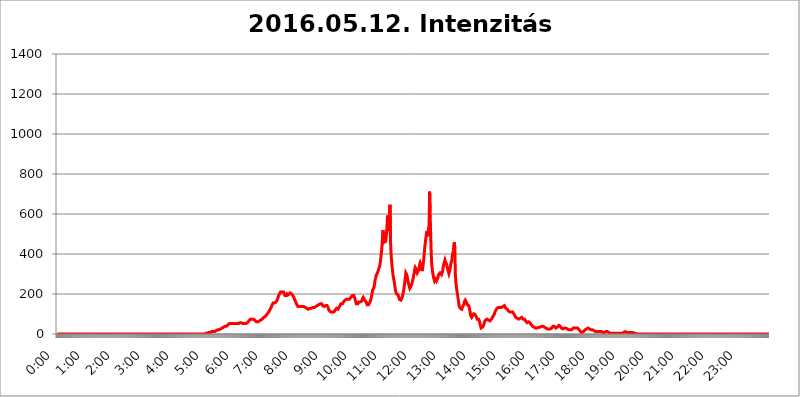
| Category | 2016.05.12. Intenzitás [W/m^2] |
|---|---|
| 0.0 | 0 |
| 0.0006944444444444445 | 0 |
| 0.001388888888888889 | 0 |
| 0.0020833333333333333 | 0 |
| 0.002777777777777778 | 0 |
| 0.003472222222222222 | 0 |
| 0.004166666666666667 | 0 |
| 0.004861111111111111 | 0 |
| 0.005555555555555556 | 0 |
| 0.0062499999999999995 | 0 |
| 0.006944444444444444 | 0 |
| 0.007638888888888889 | 0 |
| 0.008333333333333333 | 0 |
| 0.009027777777777779 | 0 |
| 0.009722222222222222 | 0 |
| 0.010416666666666666 | 0 |
| 0.011111111111111112 | 0 |
| 0.011805555555555555 | 0 |
| 0.012499999999999999 | 0 |
| 0.013194444444444444 | 0 |
| 0.013888888888888888 | 0 |
| 0.014583333333333332 | 0 |
| 0.015277777777777777 | 0 |
| 0.015972222222222224 | 0 |
| 0.016666666666666666 | 0 |
| 0.017361111111111112 | 0 |
| 0.018055555555555557 | 0 |
| 0.01875 | 0 |
| 0.019444444444444445 | 0 |
| 0.02013888888888889 | 0 |
| 0.020833333333333332 | 0 |
| 0.02152777777777778 | 0 |
| 0.022222222222222223 | 0 |
| 0.02291666666666667 | 0 |
| 0.02361111111111111 | 0 |
| 0.024305555555555556 | 0 |
| 0.024999999999999998 | 0 |
| 0.025694444444444447 | 0 |
| 0.02638888888888889 | 0 |
| 0.027083333333333334 | 0 |
| 0.027777777777777776 | 0 |
| 0.02847222222222222 | 0 |
| 0.029166666666666664 | 0 |
| 0.029861111111111113 | 0 |
| 0.030555555555555555 | 0 |
| 0.03125 | 0 |
| 0.03194444444444445 | 0 |
| 0.03263888888888889 | 0 |
| 0.03333333333333333 | 0 |
| 0.034027777777777775 | 0 |
| 0.034722222222222224 | 0 |
| 0.035416666666666666 | 0 |
| 0.036111111111111115 | 0 |
| 0.03680555555555556 | 0 |
| 0.0375 | 0 |
| 0.03819444444444444 | 0 |
| 0.03888888888888889 | 0 |
| 0.03958333333333333 | 0 |
| 0.04027777777777778 | 0 |
| 0.04097222222222222 | 0 |
| 0.041666666666666664 | 0 |
| 0.042361111111111106 | 0 |
| 0.04305555555555556 | 0 |
| 0.043750000000000004 | 0 |
| 0.044444444444444446 | 0 |
| 0.04513888888888889 | 0 |
| 0.04583333333333334 | 0 |
| 0.04652777777777778 | 0 |
| 0.04722222222222222 | 0 |
| 0.04791666666666666 | 0 |
| 0.04861111111111111 | 0 |
| 0.049305555555555554 | 0 |
| 0.049999999999999996 | 0 |
| 0.05069444444444445 | 0 |
| 0.051388888888888894 | 0 |
| 0.052083333333333336 | 0 |
| 0.05277777777777778 | 0 |
| 0.05347222222222222 | 0 |
| 0.05416666666666667 | 0 |
| 0.05486111111111111 | 0 |
| 0.05555555555555555 | 0 |
| 0.05625 | 0 |
| 0.05694444444444444 | 0 |
| 0.057638888888888885 | 0 |
| 0.05833333333333333 | 0 |
| 0.05902777777777778 | 0 |
| 0.059722222222222225 | 0 |
| 0.06041666666666667 | 0 |
| 0.061111111111111116 | 0 |
| 0.06180555555555556 | 0 |
| 0.0625 | 0 |
| 0.06319444444444444 | 0 |
| 0.06388888888888888 | 0 |
| 0.06458333333333334 | 0 |
| 0.06527777777777778 | 0 |
| 0.06597222222222222 | 0 |
| 0.06666666666666667 | 0 |
| 0.06736111111111111 | 0 |
| 0.06805555555555555 | 0 |
| 0.06874999999999999 | 0 |
| 0.06944444444444443 | 0 |
| 0.07013888888888889 | 0 |
| 0.07083333333333333 | 0 |
| 0.07152777777777779 | 0 |
| 0.07222222222222223 | 0 |
| 0.07291666666666667 | 0 |
| 0.07361111111111111 | 0 |
| 0.07430555555555556 | 0 |
| 0.075 | 0 |
| 0.07569444444444444 | 0 |
| 0.0763888888888889 | 0 |
| 0.07708333333333334 | 0 |
| 0.07777777777777778 | 0 |
| 0.07847222222222222 | 0 |
| 0.07916666666666666 | 0 |
| 0.0798611111111111 | 0 |
| 0.08055555555555556 | 0 |
| 0.08125 | 0 |
| 0.08194444444444444 | 0 |
| 0.08263888888888889 | 0 |
| 0.08333333333333333 | 0 |
| 0.08402777777777777 | 0 |
| 0.08472222222222221 | 0 |
| 0.08541666666666665 | 0 |
| 0.08611111111111112 | 0 |
| 0.08680555555555557 | 0 |
| 0.08750000000000001 | 0 |
| 0.08819444444444445 | 0 |
| 0.08888888888888889 | 0 |
| 0.08958333333333333 | 0 |
| 0.09027777777777778 | 0 |
| 0.09097222222222222 | 0 |
| 0.09166666666666667 | 0 |
| 0.09236111111111112 | 0 |
| 0.09305555555555556 | 0 |
| 0.09375 | 0 |
| 0.09444444444444444 | 0 |
| 0.09513888888888888 | 0 |
| 0.09583333333333333 | 0 |
| 0.09652777777777777 | 0 |
| 0.09722222222222222 | 0 |
| 0.09791666666666667 | 0 |
| 0.09861111111111111 | 0 |
| 0.09930555555555555 | 0 |
| 0.09999999999999999 | 0 |
| 0.10069444444444443 | 0 |
| 0.1013888888888889 | 0 |
| 0.10208333333333335 | 0 |
| 0.10277777777777779 | 0 |
| 0.10347222222222223 | 0 |
| 0.10416666666666667 | 0 |
| 0.10486111111111111 | 0 |
| 0.10555555555555556 | 0 |
| 0.10625 | 0 |
| 0.10694444444444444 | 0 |
| 0.1076388888888889 | 0 |
| 0.10833333333333334 | 0 |
| 0.10902777777777778 | 0 |
| 0.10972222222222222 | 0 |
| 0.1111111111111111 | 0 |
| 0.11180555555555556 | 0 |
| 0.11180555555555556 | 0 |
| 0.1125 | 0 |
| 0.11319444444444444 | 0 |
| 0.11388888888888889 | 0 |
| 0.11458333333333333 | 0 |
| 0.11527777777777777 | 0 |
| 0.11597222222222221 | 0 |
| 0.11666666666666665 | 0 |
| 0.1173611111111111 | 0 |
| 0.11805555555555557 | 0 |
| 0.11944444444444445 | 0 |
| 0.12013888888888889 | 0 |
| 0.12083333333333333 | 0 |
| 0.12152777777777778 | 0 |
| 0.12222222222222223 | 0 |
| 0.12291666666666667 | 0 |
| 0.12291666666666667 | 0 |
| 0.12361111111111112 | 0 |
| 0.12430555555555556 | 0 |
| 0.125 | 0 |
| 0.12569444444444444 | 0 |
| 0.12638888888888888 | 0 |
| 0.12708333333333333 | 0 |
| 0.16875 | 0 |
| 0.12847222222222224 | 0 |
| 0.12916666666666668 | 0 |
| 0.12986111111111112 | 0 |
| 0.13055555555555556 | 0 |
| 0.13125 | 0 |
| 0.13194444444444445 | 0 |
| 0.1326388888888889 | 0 |
| 0.13333333333333333 | 0 |
| 0.13402777777777777 | 0 |
| 0.13402777777777777 | 0 |
| 0.13472222222222222 | 0 |
| 0.13541666666666666 | 0 |
| 0.1361111111111111 | 0 |
| 0.13749999999999998 | 0 |
| 0.13819444444444443 | 0 |
| 0.1388888888888889 | 0 |
| 0.13958333333333334 | 0 |
| 0.14027777777777778 | 0 |
| 0.14097222222222222 | 0 |
| 0.14166666666666666 | 0 |
| 0.1423611111111111 | 0 |
| 0.14305555555555557 | 0 |
| 0.14375000000000002 | 0 |
| 0.14444444444444446 | 0 |
| 0.1451388888888889 | 0 |
| 0.1451388888888889 | 0 |
| 0.14652777777777778 | 0 |
| 0.14722222222222223 | 0 |
| 0.14791666666666667 | 0 |
| 0.1486111111111111 | 0 |
| 0.14930555555555555 | 0 |
| 0.15 | 0 |
| 0.15069444444444444 | 0 |
| 0.15138888888888888 | 0 |
| 0.15208333333333332 | 0 |
| 0.15277777777777776 | 0 |
| 0.15347222222222223 | 0 |
| 0.15416666666666667 | 0 |
| 0.15486111111111112 | 0 |
| 0.15555555555555556 | 0 |
| 0.15625 | 0 |
| 0.15694444444444444 | 0 |
| 0.15763888888888888 | 0 |
| 0.15833333333333333 | 0 |
| 0.15902777777777777 | 0 |
| 0.15972222222222224 | 0 |
| 0.16041666666666668 | 0 |
| 0.16111111111111112 | 0 |
| 0.16180555555555556 | 0 |
| 0.1625 | 0 |
| 0.16319444444444445 | 0 |
| 0.1638888888888889 | 0 |
| 0.16458333333333333 | 0 |
| 0.16527777777777777 | 0 |
| 0.16597222222222222 | 0 |
| 0.16666666666666666 | 0 |
| 0.1673611111111111 | 0 |
| 0.16805555555555554 | 0 |
| 0.16874999999999998 | 0 |
| 0.16944444444444443 | 0 |
| 0.17013888888888887 | 0 |
| 0.1708333333333333 | 0 |
| 0.17152777777777775 | 0 |
| 0.17222222222222225 | 0 |
| 0.1729166666666667 | 0 |
| 0.17361111111111113 | 0 |
| 0.17430555555555557 | 0 |
| 0.17500000000000002 | 0 |
| 0.17569444444444446 | 0 |
| 0.1763888888888889 | 0 |
| 0.17708333333333334 | 0 |
| 0.17777777777777778 | 0 |
| 0.17847222222222223 | 0 |
| 0.17916666666666667 | 0 |
| 0.1798611111111111 | 0 |
| 0.18055555555555555 | 0 |
| 0.18125 | 0 |
| 0.18194444444444444 | 0 |
| 0.1826388888888889 | 0 |
| 0.18333333333333335 | 0 |
| 0.1840277777777778 | 0 |
| 0.18472222222222223 | 0 |
| 0.18541666666666667 | 0 |
| 0.18611111111111112 | 0 |
| 0.18680555555555556 | 0 |
| 0.1875 | 0 |
| 0.18819444444444444 | 0 |
| 0.18888888888888888 | 0 |
| 0.18958333333333333 | 0 |
| 0.19027777777777777 | 0 |
| 0.1909722222222222 | 0 |
| 0.19166666666666665 | 0 |
| 0.19236111111111112 | 0 |
| 0.19305555555555554 | 0 |
| 0.19375 | 0 |
| 0.19444444444444445 | 0 |
| 0.1951388888888889 | 0 |
| 0.19583333333333333 | 0 |
| 0.19652777777777777 | 0 |
| 0.19722222222222222 | 0 |
| 0.19791666666666666 | 0 |
| 0.1986111111111111 | 0 |
| 0.19930555555555554 | 0 |
| 0.19999999999999998 | 0 |
| 0.20069444444444443 | 0 |
| 0.20138888888888887 | 0 |
| 0.2020833333333333 | 0 |
| 0.2027777777777778 | 0 |
| 0.2034722222222222 | 0 |
| 0.2041666666666667 | 0 |
| 0.20486111111111113 | 0 |
| 0.20555555555555557 | 0 |
| 0.20625000000000002 | 0 |
| 0.20694444444444446 | 0 |
| 0.2076388888888889 | 3.525 |
| 0.20833333333333334 | 3.525 |
| 0.20902777777777778 | 3.525 |
| 0.20972222222222223 | 3.525 |
| 0.21041666666666667 | 3.525 |
| 0.2111111111111111 | 3.525 |
| 0.21180555555555555 | 7.887 |
| 0.2125 | 7.887 |
| 0.21319444444444444 | 7.887 |
| 0.2138888888888889 | 7.887 |
| 0.21458333333333335 | 7.887 |
| 0.2152777777777778 | 7.887 |
| 0.21597222222222223 | 12.257 |
| 0.21666666666666667 | 12.257 |
| 0.21736111111111112 | 12.257 |
| 0.21805555555555556 | 12.257 |
| 0.21875 | 12.257 |
| 0.21944444444444444 | 12.257 |
| 0.22013888888888888 | 12.257 |
| 0.22083333333333333 | 12.257 |
| 0.22152777777777777 | 16.636 |
| 0.2222222222222222 | 16.636 |
| 0.22291666666666665 | 16.636 |
| 0.2236111111111111 | 16.636 |
| 0.22430555555555556 | 16.636 |
| 0.225 | 21.024 |
| 0.22569444444444445 | 21.024 |
| 0.2263888888888889 | 21.024 |
| 0.22708333333333333 | 21.024 |
| 0.22777777777777777 | 25.419 |
| 0.22847222222222222 | 25.419 |
| 0.22916666666666666 | 25.419 |
| 0.2298611111111111 | 25.419 |
| 0.23055555555555554 | 25.419 |
| 0.23124999999999998 | 29.823 |
| 0.23194444444444443 | 29.823 |
| 0.23263888888888887 | 29.823 |
| 0.2333333333333333 | 34.234 |
| 0.2340277777777778 | 34.234 |
| 0.2347222222222222 | 38.653 |
| 0.2354166666666667 | 38.653 |
| 0.23611111111111113 | 38.653 |
| 0.23680555555555557 | 38.653 |
| 0.23750000000000002 | 38.653 |
| 0.23819444444444446 | 43.079 |
| 0.2388888888888889 | 43.079 |
| 0.23958333333333334 | 47.511 |
| 0.24027777777777778 | 51.951 |
| 0.24097222222222223 | 51.951 |
| 0.24166666666666667 | 51.951 |
| 0.2423611111111111 | 51.951 |
| 0.24305555555555555 | 51.951 |
| 0.24375 | 51.951 |
| 0.24444444444444446 | 51.951 |
| 0.24513888888888888 | 51.951 |
| 0.24583333333333335 | 51.951 |
| 0.2465277777777778 | 51.951 |
| 0.24722222222222223 | 51.951 |
| 0.24791666666666667 | 51.951 |
| 0.24861111111111112 | 51.951 |
| 0.24930555555555556 | 51.951 |
| 0.25 | 51.951 |
| 0.25069444444444444 | 51.951 |
| 0.2513888888888889 | 51.951 |
| 0.2520833333333333 | 51.951 |
| 0.25277777777777777 | 51.951 |
| 0.2534722222222222 | 51.951 |
| 0.25416666666666665 | 51.951 |
| 0.2548611111111111 | 56.398 |
| 0.2555555555555556 | 56.398 |
| 0.25625000000000003 | 56.398 |
| 0.2569444444444445 | 56.398 |
| 0.2576388888888889 | 56.398 |
| 0.25833333333333336 | 56.398 |
| 0.2590277777777778 | 56.398 |
| 0.25972222222222224 | 51.951 |
| 0.2604166666666667 | 51.951 |
| 0.2611111111111111 | 47.511 |
| 0.26180555555555557 | 47.511 |
| 0.2625 | 51.951 |
| 0.26319444444444445 | 51.951 |
| 0.2638888888888889 | 51.951 |
| 0.26458333333333334 | 51.951 |
| 0.2652777777777778 | 56.398 |
| 0.2659722222222222 | 56.398 |
| 0.26666666666666666 | 56.398 |
| 0.2673611111111111 | 60.85 |
| 0.26805555555555555 | 60.85 |
| 0.26875 | 65.31 |
| 0.26944444444444443 | 65.31 |
| 0.2701388888888889 | 69.775 |
| 0.2708333333333333 | 74.246 |
| 0.27152777777777776 | 74.246 |
| 0.2722222222222222 | 74.246 |
| 0.27291666666666664 | 74.246 |
| 0.2736111111111111 | 74.246 |
| 0.2743055555555555 | 74.246 |
| 0.27499999999999997 | 74.246 |
| 0.27569444444444446 | 74.246 |
| 0.27638888888888885 | 69.775 |
| 0.27708333333333335 | 69.775 |
| 0.2777777777777778 | 65.31 |
| 0.27847222222222223 | 65.31 |
| 0.2791666666666667 | 60.85 |
| 0.2798611111111111 | 60.85 |
| 0.28055555555555556 | 60.85 |
| 0.28125 | 60.85 |
| 0.28194444444444444 | 60.85 |
| 0.2826388888888889 | 60.85 |
| 0.2833333333333333 | 65.31 |
| 0.28402777777777777 | 65.31 |
| 0.2847222222222222 | 65.31 |
| 0.28541666666666665 | 69.775 |
| 0.28611111111111115 | 69.775 |
| 0.28680555555555554 | 74.246 |
| 0.28750000000000003 | 74.246 |
| 0.2881944444444445 | 78.722 |
| 0.2888888888888889 | 78.722 |
| 0.28958333333333336 | 83.205 |
| 0.2902777777777778 | 83.205 |
| 0.29097222222222224 | 83.205 |
| 0.2916666666666667 | 87.692 |
| 0.2923611111111111 | 92.184 |
| 0.29305555555555557 | 92.184 |
| 0.29375 | 96.682 |
| 0.29444444444444445 | 101.184 |
| 0.2951388888888889 | 101.184 |
| 0.29583333333333334 | 105.69 |
| 0.2965277777777778 | 110.201 |
| 0.2972222222222222 | 114.716 |
| 0.29791666666666666 | 119.235 |
| 0.2986111111111111 | 123.758 |
| 0.29930555555555555 | 128.284 |
| 0.3 | 132.814 |
| 0.30069444444444443 | 137.347 |
| 0.3013888888888889 | 146.423 |
| 0.3020833333333333 | 150.964 |
| 0.30277777777777776 | 155.509 |
| 0.3034722222222222 | 155.509 |
| 0.30416666666666664 | 155.509 |
| 0.3048611111111111 | 155.509 |
| 0.3055555555555555 | 155.509 |
| 0.30624999999999997 | 155.509 |
| 0.3069444444444444 | 160.056 |
| 0.3076388888888889 | 164.605 |
| 0.30833333333333335 | 169.156 |
| 0.3090277777777778 | 173.709 |
| 0.30972222222222223 | 182.82 |
| 0.3104166666666667 | 191.937 |
| 0.3111111111111111 | 196.497 |
| 0.31180555555555556 | 201.058 |
| 0.3125 | 205.62 |
| 0.31319444444444444 | 210.182 |
| 0.3138888888888889 | 210.182 |
| 0.3145833333333333 | 210.182 |
| 0.31527777777777777 | 210.182 |
| 0.3159722222222222 | 210.182 |
| 0.31666666666666665 | 210.182 |
| 0.31736111111111115 | 210.182 |
| 0.31805555555555554 | 201.058 |
| 0.31875000000000003 | 196.497 |
| 0.3194444444444445 | 191.937 |
| 0.3201388888888889 | 191.937 |
| 0.32083333333333336 | 191.937 |
| 0.3215277777777778 | 191.937 |
| 0.32222222222222224 | 201.058 |
| 0.3229166666666667 | 201.058 |
| 0.3236111111111111 | 196.497 |
| 0.32430555555555557 | 196.497 |
| 0.325 | 196.497 |
| 0.32569444444444445 | 201.058 |
| 0.3263888888888889 | 205.62 |
| 0.32708333333333334 | 205.62 |
| 0.3277777777777778 | 205.62 |
| 0.3284722222222222 | 201.058 |
| 0.32916666666666666 | 201.058 |
| 0.3298611111111111 | 196.497 |
| 0.33055555555555555 | 191.937 |
| 0.33125 | 187.378 |
| 0.33194444444444443 | 182.82 |
| 0.3326388888888889 | 173.709 |
| 0.3333333333333333 | 169.156 |
| 0.3340277777777778 | 164.605 |
| 0.3347222222222222 | 155.509 |
| 0.3354166666666667 | 150.964 |
| 0.3361111111111111 | 146.423 |
| 0.3368055555555556 | 141.884 |
| 0.33749999999999997 | 137.347 |
| 0.33819444444444446 | 137.347 |
| 0.33888888888888885 | 132.814 |
| 0.33958333333333335 | 137.347 |
| 0.34027777777777773 | 132.814 |
| 0.34097222222222223 | 137.347 |
| 0.3416666666666666 | 137.347 |
| 0.3423611111111111 | 137.347 |
| 0.3430555555555555 | 137.347 |
| 0.34375 | 137.347 |
| 0.3444444444444445 | 137.347 |
| 0.3451388888888889 | 137.347 |
| 0.3458333333333334 | 137.347 |
| 0.34652777777777777 | 137.347 |
| 0.34722222222222227 | 132.814 |
| 0.34791666666666665 | 132.814 |
| 0.34861111111111115 | 128.284 |
| 0.34930555555555554 | 128.284 |
| 0.35000000000000003 | 128.284 |
| 0.3506944444444444 | 123.758 |
| 0.3513888888888889 | 123.758 |
| 0.3520833333333333 | 123.758 |
| 0.3527777777777778 | 123.758 |
| 0.3534722222222222 | 123.758 |
| 0.3541666666666667 | 128.284 |
| 0.3548611111111111 | 128.284 |
| 0.35555555555555557 | 128.284 |
| 0.35625 | 128.284 |
| 0.35694444444444445 | 132.814 |
| 0.3576388888888889 | 132.814 |
| 0.35833333333333334 | 132.814 |
| 0.3590277777777778 | 132.814 |
| 0.3597222222222222 | 132.814 |
| 0.36041666666666666 | 132.814 |
| 0.3611111111111111 | 132.814 |
| 0.36180555555555555 | 132.814 |
| 0.3625 | 137.347 |
| 0.36319444444444443 | 137.347 |
| 0.3638888888888889 | 141.884 |
| 0.3645833333333333 | 141.884 |
| 0.3652777777777778 | 146.423 |
| 0.3659722222222222 | 146.423 |
| 0.3666666666666667 | 146.423 |
| 0.3673611111111111 | 146.423 |
| 0.3680555555555556 | 146.423 |
| 0.36874999999999997 | 150.964 |
| 0.36944444444444446 | 150.964 |
| 0.37013888888888885 | 150.964 |
| 0.37083333333333335 | 150.964 |
| 0.37152777777777773 | 146.423 |
| 0.37222222222222223 | 141.884 |
| 0.3729166666666666 | 141.884 |
| 0.3736111111111111 | 137.347 |
| 0.3743055555555555 | 137.347 |
| 0.375 | 137.347 |
| 0.3756944444444445 | 137.347 |
| 0.3763888888888889 | 141.884 |
| 0.3770833333333334 | 146.423 |
| 0.37777777777777777 | 146.423 |
| 0.37847222222222227 | 141.884 |
| 0.37916666666666665 | 141.884 |
| 0.37986111111111115 | 132.814 |
| 0.38055555555555554 | 123.758 |
| 0.38125000000000003 | 119.235 |
| 0.3819444444444444 | 114.716 |
| 0.3826388888888889 | 110.201 |
| 0.3833333333333333 | 110.201 |
| 0.3840277777777778 | 110.201 |
| 0.3847222222222222 | 105.69 |
| 0.3854166666666667 | 105.69 |
| 0.3861111111111111 | 110.201 |
| 0.38680555555555557 | 110.201 |
| 0.3875 | 110.201 |
| 0.38819444444444445 | 110.201 |
| 0.3888888888888889 | 114.716 |
| 0.38958333333333334 | 119.235 |
| 0.3902777777777778 | 119.235 |
| 0.3909722222222222 | 123.758 |
| 0.39166666666666666 | 128.284 |
| 0.3923611111111111 | 128.284 |
| 0.39305555555555555 | 123.758 |
| 0.39375 | 123.758 |
| 0.39444444444444443 | 128.284 |
| 0.3951388888888889 | 132.814 |
| 0.3958333333333333 | 137.347 |
| 0.3965277777777778 | 141.884 |
| 0.3972222222222222 | 146.423 |
| 0.3979166666666667 | 150.964 |
| 0.3986111111111111 | 150.964 |
| 0.3993055555555556 | 146.423 |
| 0.39999999999999997 | 150.964 |
| 0.40069444444444446 | 155.509 |
| 0.40138888888888885 | 160.056 |
| 0.40208333333333335 | 160.056 |
| 0.40277777777777773 | 164.605 |
| 0.40347222222222223 | 169.156 |
| 0.4041666666666666 | 173.709 |
| 0.4048611111111111 | 173.709 |
| 0.4055555555555555 | 173.709 |
| 0.40625 | 173.709 |
| 0.4069444444444445 | 173.709 |
| 0.4076388888888889 | 173.709 |
| 0.4083333333333334 | 173.709 |
| 0.40902777777777777 | 173.709 |
| 0.40972222222222227 | 173.709 |
| 0.41041666666666665 | 178.264 |
| 0.41111111111111115 | 178.264 |
| 0.41180555555555554 | 182.82 |
| 0.41250000000000003 | 182.82 |
| 0.4131944444444444 | 187.378 |
| 0.4138888888888889 | 191.937 |
| 0.4145833333333333 | 191.937 |
| 0.4152777777777778 | 191.937 |
| 0.4159722222222222 | 191.937 |
| 0.4166666666666667 | 187.378 |
| 0.4173611111111111 | 178.264 |
| 0.41805555555555557 | 169.156 |
| 0.41875 | 160.056 |
| 0.41944444444444445 | 150.964 |
| 0.4201388888888889 | 146.423 |
| 0.42083333333333334 | 146.423 |
| 0.4215277777777778 | 150.964 |
| 0.4222222222222222 | 155.509 |
| 0.42291666666666666 | 160.056 |
| 0.4236111111111111 | 160.056 |
| 0.42430555555555555 | 164.605 |
| 0.425 | 160.056 |
| 0.42569444444444443 | 160.056 |
| 0.4263888888888889 | 160.056 |
| 0.4270833333333333 | 164.605 |
| 0.4277777777777778 | 173.709 |
| 0.4284722222222222 | 178.264 |
| 0.4291666666666667 | 182.82 |
| 0.4298611111111111 | 187.378 |
| 0.4305555555555556 | 178.264 |
| 0.43124999999999997 | 169.156 |
| 0.43194444444444446 | 164.605 |
| 0.43263888888888885 | 164.605 |
| 0.43333333333333335 | 160.056 |
| 0.43402777777777773 | 155.509 |
| 0.43472222222222223 | 146.423 |
| 0.4354166666666666 | 146.423 |
| 0.4361111111111111 | 141.884 |
| 0.4368055555555555 | 146.423 |
| 0.4375 | 146.423 |
| 0.4381944444444445 | 155.509 |
| 0.4388888888888889 | 160.056 |
| 0.4395833333333334 | 169.156 |
| 0.44027777777777777 | 178.264 |
| 0.44097222222222227 | 191.937 |
| 0.44166666666666665 | 205.62 |
| 0.44236111111111115 | 219.309 |
| 0.44305555555555554 | 223.873 |
| 0.44375000000000003 | 228.436 |
| 0.4444444444444444 | 237.564 |
| 0.4451388888888889 | 251.251 |
| 0.4458333333333333 | 269.49 |
| 0.4465277777777778 | 278.603 |
| 0.4472222222222222 | 292.259 |
| 0.4479166666666667 | 296.808 |
| 0.4486111111111111 | 301.354 |
| 0.44930555555555557 | 305.898 |
| 0.45 | 314.98 |
| 0.45069444444444445 | 324.052 |
| 0.4513888888888889 | 328.584 |
| 0.45208333333333334 | 337.639 |
| 0.4527777777777778 | 351.198 |
| 0.4534722222222222 | 369.23 |
| 0.45416666666666666 | 391.685 |
| 0.4548611111111111 | 414.035 |
| 0.45555555555555555 | 445.129 |
| 0.45625 | 484.735 |
| 0.45694444444444443 | 519.555 |
| 0.4576388888888889 | 475.972 |
| 0.4583333333333333 | 458.38 |
| 0.4590277777777778 | 458.38 |
| 0.4597222222222222 | 458.38 |
| 0.4604166666666667 | 462.786 |
| 0.4611111111111111 | 475.972 |
| 0.4618055555555556 | 502.192 |
| 0.46249999999999997 | 536.82 |
| 0.46319444444444446 | 592.233 |
| 0.46388888888888885 | 562.53 |
| 0.46458333333333335 | 549.704 |
| 0.46527777777777773 | 515.223 |
| 0.46597222222222223 | 549.704 |
| 0.4666666666666666 | 646.537 |
| 0.4673611111111111 | 471.582 |
| 0.4680555555555555 | 409.574 |
| 0.46875 | 373.729 |
| 0.4694444444444445 | 342.162 |
| 0.4701388888888889 | 319.517 |
| 0.4708333333333334 | 296.808 |
| 0.47152777777777777 | 283.156 |
| 0.47222222222222227 | 269.49 |
| 0.47291666666666665 | 255.813 |
| 0.47361111111111115 | 237.564 |
| 0.47430555555555554 | 219.309 |
| 0.47500000000000003 | 210.182 |
| 0.4756944444444444 | 201.058 |
| 0.4763888888888889 | 201.058 |
| 0.4770833333333333 | 201.058 |
| 0.4777777777777778 | 196.497 |
| 0.4784722222222222 | 191.937 |
| 0.4791666666666667 | 182.82 |
| 0.4798611111111111 | 173.709 |
| 0.48055555555555557 | 169.156 |
| 0.48125 | 169.156 |
| 0.48194444444444445 | 169.156 |
| 0.4826388888888889 | 173.709 |
| 0.48333333333333334 | 178.264 |
| 0.4840277777777778 | 187.378 |
| 0.4847222222222222 | 196.497 |
| 0.48541666666666666 | 210.182 |
| 0.4861111111111111 | 223.873 |
| 0.48680555555555555 | 242.127 |
| 0.4875 | 260.373 |
| 0.48819444444444443 | 283.156 |
| 0.4888888888888889 | 305.898 |
| 0.4895833333333333 | 305.898 |
| 0.4902777777777778 | 296.808 |
| 0.4909722222222222 | 283.156 |
| 0.4916666666666667 | 269.49 |
| 0.4923611111111111 | 255.813 |
| 0.4930555555555556 | 246.689 |
| 0.49374999999999997 | 237.564 |
| 0.49444444444444446 | 228.436 |
| 0.49513888888888885 | 228.436 |
| 0.49583333333333335 | 233 |
| 0.49652777777777773 | 242.127 |
| 0.49722222222222223 | 251.251 |
| 0.4979166666666666 | 260.373 |
| 0.4986111111111111 | 260.373 |
| 0.4993055555555555 | 278.603 |
| 0.5 | 296.808 |
| 0.5006944444444444 | 305.898 |
| 0.5013888888888889 | 324.052 |
| 0.5020833333333333 | 333.113 |
| 0.5027777777777778 | 328.584 |
| 0.5034722222222222 | 324.052 |
| 0.5041666666666667 | 314.98 |
| 0.5048611111111111 | 305.898 |
| 0.5055555555555555 | 305.898 |
| 0.50625 | 310.44 |
| 0.5069444444444444 | 319.517 |
| 0.5076388888888889 | 333.113 |
| 0.5083333333333333 | 346.682 |
| 0.5090277777777777 | 355.712 |
| 0.5097222222222222 | 351.198 |
| 0.5104166666666666 | 342.162 |
| 0.5111111111111112 | 324.052 |
| 0.5118055555555555 | 314.98 |
| 0.5125000000000001 | 328.584 |
| 0.5131944444444444 | 346.682 |
| 0.513888888888889 | 369.23 |
| 0.5145833333333333 | 396.164 |
| 0.5152777777777778 | 427.39 |
| 0.5159722222222222 | 449.551 |
| 0.5166666666666667 | 471.582 |
| 0.517361111111111 | 489.108 |
| 0.5180555555555556 | 506.542 |
| 0.5187499999999999 | 515.223 |
| 0.5194444444444445 | 515.223 |
| 0.5201388888888888 | 489.108 |
| 0.5208333333333334 | 489.108 |
| 0.5215277777777778 | 541.121 |
| 0.5222222222222223 | 711.832 |
| 0.5229166666666667 | 609.062 |
| 0.5236111111111111 | 609.062 |
| 0.5243055555555556 | 427.39 |
| 0.525 | 360.221 |
| 0.5256944444444445 | 333.113 |
| 0.5263888888888889 | 310.44 |
| 0.5270833333333333 | 296.808 |
| 0.5277777777777778 | 283.156 |
| 0.5284722222222222 | 274.047 |
| 0.5291666666666667 | 264.932 |
| 0.5298611111111111 | 269.49 |
| 0.5305555555555556 | 274.047 |
| 0.53125 | 269.49 |
| 0.5319444444444444 | 264.932 |
| 0.5326388888888889 | 264.932 |
| 0.5333333333333333 | 269.49 |
| 0.5340277777777778 | 283.156 |
| 0.5347222222222222 | 296.808 |
| 0.5354166666666667 | 296.808 |
| 0.5361111111111111 | 301.354 |
| 0.5368055555555555 | 305.898 |
| 0.5375 | 301.354 |
| 0.5381944444444444 | 305.898 |
| 0.5388888888888889 | 296.808 |
| 0.5395833333333333 | 301.354 |
| 0.5402777777777777 | 310.44 |
| 0.5409722222222222 | 324.052 |
| 0.5416666666666666 | 342.162 |
| 0.5423611111111112 | 351.198 |
| 0.5430555555555555 | 360.221 |
| 0.5437500000000001 | 369.23 |
| 0.5444444444444444 | 360.221 |
| 0.545138888888889 | 355.712 |
| 0.5458333333333333 | 351.198 |
| 0.5465277777777778 | 342.162 |
| 0.5472222222222222 | 328.584 |
| 0.5479166666666667 | 319.517 |
| 0.548611111111111 | 310.44 |
| 0.5493055555555556 | 301.354 |
| 0.5499999999999999 | 305.898 |
| 0.5506944444444445 | 319.517 |
| 0.5513888888888888 | 337.639 |
| 0.5520833333333334 | 351.198 |
| 0.5527777777777778 | 355.712 |
| 0.5534722222222223 | 369.23 |
| 0.5541666666666667 | 391.685 |
| 0.5548611111111111 | 405.108 |
| 0.5555555555555556 | 414.035 |
| 0.55625 | 445.129 |
| 0.5569444444444445 | 458.38 |
| 0.5576388888888889 | 422.943 |
| 0.5583333333333333 | 301.354 |
| 0.5590277777777778 | 260.373 |
| 0.5597222222222222 | 237.564 |
| 0.5604166666666667 | 219.309 |
| 0.5611111111111111 | 205.62 |
| 0.5618055555555556 | 187.378 |
| 0.5625 | 169.156 |
| 0.5631944444444444 | 150.964 |
| 0.5638888888888889 | 137.347 |
| 0.5645833333333333 | 132.814 |
| 0.5652777777777778 | 128.284 |
| 0.5659722222222222 | 123.758 |
| 0.5666666666666667 | 123.758 |
| 0.5673611111111111 | 123.758 |
| 0.5680555555555555 | 128.284 |
| 0.56875 | 137.347 |
| 0.5694444444444444 | 141.884 |
| 0.5701388888888889 | 146.423 |
| 0.5708333333333333 | 160.056 |
| 0.5715277777777777 | 164.605 |
| 0.5722222222222222 | 169.156 |
| 0.5729166666666666 | 169.156 |
| 0.5736111111111112 | 164.605 |
| 0.5743055555555555 | 155.509 |
| 0.5750000000000001 | 146.423 |
| 0.5756944444444444 | 141.884 |
| 0.576388888888889 | 146.423 |
| 0.5770833333333333 | 141.884 |
| 0.5777777777777778 | 132.814 |
| 0.5784722222222222 | 119.235 |
| 0.5791666666666667 | 110.201 |
| 0.579861111111111 | 92.184 |
| 0.5805555555555556 | 87.692 |
| 0.5812499999999999 | 83.205 |
| 0.5819444444444445 | 87.692 |
| 0.5826388888888888 | 92.184 |
| 0.5833333333333334 | 96.682 |
| 0.5840277777777778 | 101.184 |
| 0.5847222222222223 | 96.682 |
| 0.5854166666666667 | 96.682 |
| 0.5861111111111111 | 96.682 |
| 0.5868055555555556 | 96.682 |
| 0.5875 | 92.184 |
| 0.5881944444444445 | 83.205 |
| 0.5888888888888889 | 74.246 |
| 0.5895833333333333 | 69.775 |
| 0.5902777777777778 | 74.246 |
| 0.5909722222222222 | 74.246 |
| 0.5916666666666667 | 69.775 |
| 0.5923611111111111 | 60.85 |
| 0.5930555555555556 | 47.511 |
| 0.59375 | 38.653 |
| 0.5944444444444444 | 29.823 |
| 0.5951388888888889 | 29.823 |
| 0.5958333333333333 | 29.823 |
| 0.5965277777777778 | 34.234 |
| 0.5972222222222222 | 38.653 |
| 0.5979166666666667 | 43.079 |
| 0.5986111111111111 | 51.951 |
| 0.5993055555555555 | 60.85 |
| 0.6 | 65.31 |
| 0.6006944444444444 | 69.775 |
| 0.6013888888888889 | 74.246 |
| 0.6020833333333333 | 74.246 |
| 0.6027777777777777 | 74.246 |
| 0.6034722222222222 | 74.246 |
| 0.6041666666666666 | 69.775 |
| 0.6048611111111112 | 69.775 |
| 0.6055555555555555 | 65.31 |
| 0.6062500000000001 | 65.31 |
| 0.6069444444444444 | 65.31 |
| 0.607638888888889 | 65.31 |
| 0.6083333333333333 | 65.31 |
| 0.6090277777777778 | 74.246 |
| 0.6097222222222222 | 78.722 |
| 0.6104166666666667 | 83.205 |
| 0.611111111111111 | 87.692 |
| 0.6118055555555556 | 92.184 |
| 0.6124999999999999 | 96.682 |
| 0.6131944444444445 | 101.184 |
| 0.6138888888888888 | 110.201 |
| 0.6145833333333334 | 114.716 |
| 0.6152777777777778 | 119.235 |
| 0.6159722222222223 | 123.758 |
| 0.6166666666666667 | 128.284 |
| 0.6173611111111111 | 128.284 |
| 0.6180555555555556 | 128.284 |
| 0.61875 | 132.814 |
| 0.6194444444444445 | 132.814 |
| 0.6201388888888889 | 132.814 |
| 0.6208333333333333 | 132.814 |
| 0.6215277777777778 | 137.347 |
| 0.6222222222222222 | 137.347 |
| 0.6229166666666667 | 132.814 |
| 0.6236111111111111 | 132.814 |
| 0.6243055555555556 | 132.814 |
| 0.625 | 137.347 |
| 0.6256944444444444 | 137.347 |
| 0.6263888888888889 | 141.884 |
| 0.6270833333333333 | 141.884 |
| 0.6277777777777778 | 137.347 |
| 0.6284722222222222 | 137.347 |
| 0.6291666666666667 | 128.284 |
| 0.6298611111111111 | 128.284 |
| 0.6305555555555555 | 128.284 |
| 0.63125 | 123.758 |
| 0.6319444444444444 | 119.235 |
| 0.6326388888888889 | 114.716 |
| 0.6333333333333333 | 110.201 |
| 0.6340277777777777 | 110.201 |
| 0.6347222222222222 | 110.201 |
| 0.6354166666666666 | 110.201 |
| 0.6361111111111112 | 110.201 |
| 0.6368055555555555 | 110.201 |
| 0.6375000000000001 | 110.201 |
| 0.6381944444444444 | 110.201 |
| 0.638888888888889 | 110.201 |
| 0.6395833333333333 | 105.69 |
| 0.6402777777777778 | 101.184 |
| 0.6409722222222222 | 96.682 |
| 0.6416666666666667 | 92.184 |
| 0.642361111111111 | 87.692 |
| 0.6430555555555556 | 83.205 |
| 0.6437499999999999 | 83.205 |
| 0.6444444444444445 | 78.722 |
| 0.6451388888888888 | 78.722 |
| 0.6458333333333334 | 74.246 |
| 0.6465277777777778 | 74.246 |
| 0.6472222222222223 | 74.246 |
| 0.6479166666666667 | 74.246 |
| 0.6486111111111111 | 74.246 |
| 0.6493055555555556 | 78.722 |
| 0.65 | 78.722 |
| 0.6506944444444445 | 83.205 |
| 0.6513888888888889 | 83.205 |
| 0.6520833333333333 | 83.205 |
| 0.6527777777777778 | 78.722 |
| 0.6534722222222222 | 74.246 |
| 0.6541666666666667 | 74.246 |
| 0.6548611111111111 | 74.246 |
| 0.6555555555555556 | 74.246 |
| 0.65625 | 69.775 |
| 0.6569444444444444 | 65.31 |
| 0.6576388888888889 | 60.85 |
| 0.6583333333333333 | 60.85 |
| 0.6590277777777778 | 56.398 |
| 0.6597222222222222 | 60.85 |
| 0.6604166666666667 | 60.85 |
| 0.6611111111111111 | 60.85 |
| 0.6618055555555555 | 56.398 |
| 0.6625 | 56.398 |
| 0.6631944444444444 | 56.398 |
| 0.6638888888888889 | 51.951 |
| 0.6645833333333333 | 47.511 |
| 0.6652777777777777 | 47.511 |
| 0.6659722222222222 | 43.079 |
| 0.6666666666666666 | 38.653 |
| 0.6673611111111111 | 38.653 |
| 0.6680555555555556 | 34.234 |
| 0.6687500000000001 | 34.234 |
| 0.6694444444444444 | 29.823 |
| 0.6701388888888888 | 29.823 |
| 0.6708333333333334 | 29.823 |
| 0.6715277777777778 | 29.823 |
| 0.6722222222222222 | 29.823 |
| 0.6729166666666666 | 29.823 |
| 0.6736111111111112 | 29.823 |
| 0.6743055555555556 | 29.823 |
| 0.6749999999999999 | 34.234 |
| 0.6756944444444444 | 34.234 |
| 0.6763888888888889 | 34.234 |
| 0.6770833333333334 | 34.234 |
| 0.6777777777777777 | 38.653 |
| 0.6784722222222223 | 38.653 |
| 0.6791666666666667 | 38.653 |
| 0.6798611111111111 | 38.653 |
| 0.6805555555555555 | 43.079 |
| 0.68125 | 38.653 |
| 0.6819444444444445 | 38.653 |
| 0.6826388888888889 | 34.234 |
| 0.6833333333333332 | 34.234 |
| 0.6840277777777778 | 29.823 |
| 0.6847222222222222 | 29.823 |
| 0.6854166666666667 | 29.823 |
| 0.686111111111111 | 25.419 |
| 0.6868055555555556 | 25.419 |
| 0.6875 | 25.419 |
| 0.6881944444444444 | 25.419 |
| 0.688888888888889 | 25.419 |
| 0.6895833333333333 | 25.419 |
| 0.6902777777777778 | 25.419 |
| 0.6909722222222222 | 25.419 |
| 0.6916666666666668 | 25.419 |
| 0.6923611111111111 | 29.823 |
| 0.6930555555555555 | 29.823 |
| 0.69375 | 29.823 |
| 0.6944444444444445 | 34.234 |
| 0.6951388888888889 | 38.653 |
| 0.6958333333333333 | 38.653 |
| 0.6965277777777777 | 38.653 |
| 0.6972222222222223 | 38.653 |
| 0.6979166666666666 | 34.234 |
| 0.6986111111111111 | 34.234 |
| 0.6993055555555556 | 29.823 |
| 0.7000000000000001 | 34.234 |
| 0.7006944444444444 | 34.234 |
| 0.7013888888888888 | 34.234 |
| 0.7020833333333334 | 38.653 |
| 0.7027777777777778 | 38.653 |
| 0.7034722222222222 | 43.079 |
| 0.7041666666666666 | 43.079 |
| 0.7048611111111112 | 43.079 |
| 0.7055555555555556 | 38.653 |
| 0.7062499999999999 | 34.234 |
| 0.7069444444444444 | 29.823 |
| 0.7076388888888889 | 25.419 |
| 0.7083333333333334 | 25.419 |
| 0.7090277777777777 | 25.419 |
| 0.7097222222222223 | 25.419 |
| 0.7104166666666667 | 29.823 |
| 0.7111111111111111 | 29.823 |
| 0.7118055555555555 | 29.823 |
| 0.7125 | 29.823 |
| 0.7131944444444445 | 29.823 |
| 0.7138888888888889 | 29.823 |
| 0.7145833333333332 | 25.419 |
| 0.7152777777777778 | 25.419 |
| 0.7159722222222222 | 21.024 |
| 0.7166666666666667 | 21.024 |
| 0.717361111111111 | 21.024 |
| 0.7180555555555556 | 21.024 |
| 0.71875 | 21.024 |
| 0.7194444444444444 | 21.024 |
| 0.720138888888889 | 21.024 |
| 0.7208333333333333 | 21.024 |
| 0.7215277777777778 | 21.024 |
| 0.7222222222222222 | 21.024 |
| 0.7229166666666668 | 25.419 |
| 0.7236111111111111 | 29.823 |
| 0.7243055555555555 | 29.823 |
| 0.725 | 29.823 |
| 0.7256944444444445 | 29.823 |
| 0.7263888888888889 | 29.823 |
| 0.7270833333333333 | 29.823 |
| 0.7277777777777777 | 29.823 |
| 0.7284722222222223 | 29.823 |
| 0.7291666666666666 | 29.823 |
| 0.7298611111111111 | 29.823 |
| 0.7305555555555556 | 25.419 |
| 0.7312500000000001 | 25.419 |
| 0.7319444444444444 | 21.024 |
| 0.7326388888888888 | 16.636 |
| 0.7333333333333334 | 16.636 |
| 0.7340277777777778 | 12.257 |
| 0.7347222222222222 | 12.257 |
| 0.7354166666666666 | 7.887 |
| 0.7361111111111112 | 7.887 |
| 0.7368055555555556 | 7.887 |
| 0.7374999999999999 | 12.257 |
| 0.7381944444444444 | 12.257 |
| 0.7388888888888889 | 16.636 |
| 0.7395833333333334 | 16.636 |
| 0.7402777777777777 | 21.024 |
| 0.7409722222222223 | 21.024 |
| 0.7416666666666667 | 21.024 |
| 0.7423611111111111 | 25.419 |
| 0.7430555555555555 | 29.823 |
| 0.74375 | 29.823 |
| 0.7444444444444445 | 29.823 |
| 0.7451388888888889 | 25.419 |
| 0.7458333333333332 | 25.419 |
| 0.7465277777777778 | 25.419 |
| 0.7472222222222222 | 21.024 |
| 0.7479166666666667 | 21.024 |
| 0.748611111111111 | 21.024 |
| 0.7493055555555556 | 21.024 |
| 0.75 | 21.024 |
| 0.7506944444444444 | 21.024 |
| 0.751388888888889 | 21.024 |
| 0.7520833333333333 | 21.024 |
| 0.7527777777777778 | 16.636 |
| 0.7534722222222222 | 16.636 |
| 0.7541666666666668 | 12.257 |
| 0.7548611111111111 | 12.257 |
| 0.7555555555555555 | 7.887 |
| 0.75625 | 12.257 |
| 0.7569444444444445 | 12.257 |
| 0.7576388888888889 | 12.257 |
| 0.7583333333333333 | 12.257 |
| 0.7590277777777777 | 12.257 |
| 0.7597222222222223 | 16.636 |
| 0.7604166666666666 | 12.257 |
| 0.7611111111111111 | 12.257 |
| 0.7618055555555556 | 12.257 |
| 0.7625000000000001 | 12.257 |
| 0.7631944444444444 | 12.257 |
| 0.7638888888888888 | 7.887 |
| 0.7645833333333334 | 12.257 |
| 0.7652777777777778 | 7.887 |
| 0.7659722222222222 | 12.257 |
| 0.7666666666666666 | 7.887 |
| 0.7673611111111112 | 7.887 |
| 0.7680555555555556 | 7.887 |
| 0.7687499999999999 | 7.887 |
| 0.7694444444444444 | 12.257 |
| 0.7701388888888889 | 12.257 |
| 0.7708333333333334 | 12.257 |
| 0.7715277777777777 | 12.257 |
| 0.7722222222222223 | 12.257 |
| 0.7729166666666667 | 7.887 |
| 0.7736111111111111 | 7.887 |
| 0.7743055555555555 | 3.525 |
| 0.775 | 3.525 |
| 0.7756944444444445 | 3.525 |
| 0.7763888888888889 | 3.525 |
| 0.7770833333333332 | 3.525 |
| 0.7777777777777778 | 3.525 |
| 0.7784722222222222 | 3.525 |
| 0.7791666666666667 | 3.525 |
| 0.779861111111111 | 3.525 |
| 0.7805555555555556 | 3.525 |
| 0.78125 | 3.525 |
| 0.7819444444444444 | 3.525 |
| 0.782638888888889 | 3.525 |
| 0.7833333333333333 | 3.525 |
| 0.7840277777777778 | 3.525 |
| 0.7847222222222222 | 3.525 |
| 0.7854166666666668 | 3.525 |
| 0.7861111111111111 | 3.525 |
| 0.7868055555555555 | 3.525 |
| 0.7875 | 3.525 |
| 0.7881944444444445 | 3.525 |
| 0.7888888888888889 | 3.525 |
| 0.7895833333333333 | 3.525 |
| 0.7902777777777777 | 3.525 |
| 0.7909722222222223 | 3.525 |
| 0.7916666666666666 | 3.525 |
| 0.7923611111111111 | 3.525 |
| 0.7930555555555556 | 3.525 |
| 0.7937500000000001 | 7.887 |
| 0.7944444444444444 | 7.887 |
| 0.7951388888888888 | 7.887 |
| 0.7958333333333334 | 12.257 |
| 0.7965277777777778 | 12.257 |
| 0.7972222222222222 | 7.887 |
| 0.7979166666666666 | 7.887 |
| 0.7986111111111112 | 7.887 |
| 0.7993055555555556 | 7.887 |
| 0.7999999999999999 | 7.887 |
| 0.8006944444444444 | 7.887 |
| 0.8013888888888889 | 7.887 |
| 0.8020833333333334 | 7.887 |
| 0.8027777777777777 | 7.887 |
| 0.8034722222222223 | 7.887 |
| 0.8041666666666667 | 7.887 |
| 0.8048611111111111 | 7.887 |
| 0.8055555555555555 | 7.887 |
| 0.80625 | 7.887 |
| 0.8069444444444445 | 7.887 |
| 0.8076388888888889 | 3.525 |
| 0.8083333333333332 | 3.525 |
| 0.8090277777777778 | 3.525 |
| 0.8097222222222222 | 3.525 |
| 0.8104166666666667 | 3.525 |
| 0.811111111111111 | 3.525 |
| 0.8118055555555556 | 3.525 |
| 0.8125 | 3.525 |
| 0.8131944444444444 | 0 |
| 0.813888888888889 | 0 |
| 0.8145833333333333 | 0 |
| 0.8152777777777778 | 0 |
| 0.8159722222222222 | 0 |
| 0.8166666666666668 | 0 |
| 0.8173611111111111 | 0 |
| 0.8180555555555555 | 0 |
| 0.81875 | 0 |
| 0.8194444444444445 | 0 |
| 0.8201388888888889 | 0 |
| 0.8208333333333333 | 0 |
| 0.8215277777777777 | 0 |
| 0.8222222222222223 | 0 |
| 0.8229166666666666 | 0 |
| 0.8236111111111111 | 0 |
| 0.8243055555555556 | 0 |
| 0.8250000000000001 | 0 |
| 0.8256944444444444 | 0 |
| 0.8263888888888888 | 0 |
| 0.8270833333333334 | 0 |
| 0.8277777777777778 | 0 |
| 0.8284722222222222 | 0 |
| 0.8291666666666666 | 0 |
| 0.8298611111111112 | 0 |
| 0.8305555555555556 | 0 |
| 0.8312499999999999 | 0 |
| 0.8319444444444444 | 0 |
| 0.8326388888888889 | 0 |
| 0.8333333333333334 | 0 |
| 0.8340277777777777 | 0 |
| 0.8347222222222223 | 0 |
| 0.8354166666666667 | 0 |
| 0.8361111111111111 | 0 |
| 0.8368055555555555 | 0 |
| 0.8375 | 0 |
| 0.8381944444444445 | 0 |
| 0.8388888888888889 | 0 |
| 0.8395833333333332 | 0 |
| 0.8402777777777778 | 0 |
| 0.8409722222222222 | 0 |
| 0.8416666666666667 | 0 |
| 0.842361111111111 | 0 |
| 0.8430555555555556 | 0 |
| 0.84375 | 0 |
| 0.8444444444444444 | 0 |
| 0.845138888888889 | 0 |
| 0.8458333333333333 | 0 |
| 0.8465277777777778 | 0 |
| 0.8472222222222222 | 0 |
| 0.8479166666666668 | 0 |
| 0.8486111111111111 | 0 |
| 0.8493055555555555 | 0 |
| 0.85 | 0 |
| 0.8506944444444445 | 0 |
| 0.8513888888888889 | 0 |
| 0.8520833333333333 | 0 |
| 0.8527777777777777 | 0 |
| 0.8534722222222223 | 0 |
| 0.8541666666666666 | 0 |
| 0.8548611111111111 | 0 |
| 0.8555555555555556 | 0 |
| 0.8562500000000001 | 0 |
| 0.8569444444444444 | 0 |
| 0.8576388888888888 | 0 |
| 0.8583333333333334 | 0 |
| 0.8590277777777778 | 0 |
| 0.8597222222222222 | 0 |
| 0.8604166666666666 | 0 |
| 0.8611111111111112 | 0 |
| 0.8618055555555556 | 0 |
| 0.8624999999999999 | 0 |
| 0.8631944444444444 | 0 |
| 0.8638888888888889 | 0 |
| 0.8645833333333334 | 0 |
| 0.8652777777777777 | 0 |
| 0.8659722222222223 | 0 |
| 0.8666666666666667 | 0 |
| 0.8673611111111111 | 0 |
| 0.8680555555555555 | 0 |
| 0.86875 | 0 |
| 0.8694444444444445 | 0 |
| 0.8701388888888889 | 0 |
| 0.8708333333333332 | 0 |
| 0.8715277777777778 | 0 |
| 0.8722222222222222 | 0 |
| 0.8729166666666667 | 0 |
| 0.873611111111111 | 0 |
| 0.8743055555555556 | 0 |
| 0.875 | 0 |
| 0.8756944444444444 | 0 |
| 0.876388888888889 | 0 |
| 0.8770833333333333 | 0 |
| 0.8777777777777778 | 0 |
| 0.8784722222222222 | 0 |
| 0.8791666666666668 | 0 |
| 0.8798611111111111 | 0 |
| 0.8805555555555555 | 0 |
| 0.88125 | 0 |
| 0.8819444444444445 | 0 |
| 0.8826388888888889 | 0 |
| 0.8833333333333333 | 0 |
| 0.8840277777777777 | 0 |
| 0.8847222222222223 | 0 |
| 0.8854166666666666 | 0 |
| 0.8861111111111111 | 0 |
| 0.8868055555555556 | 0 |
| 0.8875000000000001 | 0 |
| 0.8881944444444444 | 0 |
| 0.8888888888888888 | 0 |
| 0.8895833333333334 | 0 |
| 0.8902777777777778 | 0 |
| 0.8909722222222222 | 0 |
| 0.8916666666666666 | 0 |
| 0.8923611111111112 | 0 |
| 0.8930555555555556 | 0 |
| 0.8937499999999999 | 0 |
| 0.8944444444444444 | 0 |
| 0.8951388888888889 | 0 |
| 0.8958333333333334 | 0 |
| 0.8965277777777777 | 0 |
| 0.8972222222222223 | 0 |
| 0.8979166666666667 | 0 |
| 0.8986111111111111 | 0 |
| 0.8993055555555555 | 0 |
| 0.9 | 0 |
| 0.9006944444444445 | 0 |
| 0.9013888888888889 | 0 |
| 0.9020833333333332 | 0 |
| 0.9027777777777778 | 0 |
| 0.9034722222222222 | 0 |
| 0.9041666666666667 | 0 |
| 0.904861111111111 | 0 |
| 0.9055555555555556 | 0 |
| 0.90625 | 0 |
| 0.9069444444444444 | 0 |
| 0.907638888888889 | 0 |
| 0.9083333333333333 | 0 |
| 0.9090277777777778 | 0 |
| 0.9097222222222222 | 0 |
| 0.9104166666666668 | 0 |
| 0.9111111111111111 | 0 |
| 0.9118055555555555 | 0 |
| 0.9125 | 0 |
| 0.9131944444444445 | 0 |
| 0.9138888888888889 | 0 |
| 0.9145833333333333 | 0 |
| 0.9152777777777777 | 0 |
| 0.9159722222222223 | 0 |
| 0.9166666666666666 | 0 |
| 0.9173611111111111 | 0 |
| 0.9180555555555556 | 0 |
| 0.9187500000000001 | 0 |
| 0.9194444444444444 | 0 |
| 0.9201388888888888 | 0 |
| 0.9208333333333334 | 0 |
| 0.9215277777777778 | 0 |
| 0.9222222222222222 | 0 |
| 0.9229166666666666 | 0 |
| 0.9236111111111112 | 0 |
| 0.9243055555555556 | 0 |
| 0.9249999999999999 | 0 |
| 0.9256944444444444 | 0 |
| 0.9263888888888889 | 0 |
| 0.9270833333333334 | 0 |
| 0.9277777777777777 | 0 |
| 0.9284722222222223 | 0 |
| 0.9291666666666667 | 0 |
| 0.9298611111111111 | 0 |
| 0.9305555555555555 | 0 |
| 0.93125 | 0 |
| 0.9319444444444445 | 0 |
| 0.9326388888888889 | 0 |
| 0.9333333333333332 | 0 |
| 0.9340277777777778 | 0 |
| 0.9347222222222222 | 0 |
| 0.9354166666666667 | 0 |
| 0.936111111111111 | 0 |
| 0.9368055555555556 | 0 |
| 0.9375 | 0 |
| 0.9381944444444444 | 0 |
| 0.938888888888889 | 0 |
| 0.9395833333333333 | 0 |
| 0.9402777777777778 | 0 |
| 0.9409722222222222 | 0 |
| 0.9416666666666668 | 0 |
| 0.9423611111111111 | 0 |
| 0.9430555555555555 | 0 |
| 0.94375 | 0 |
| 0.9444444444444445 | 0 |
| 0.9451388888888889 | 0 |
| 0.9458333333333333 | 0 |
| 0.9465277777777777 | 0 |
| 0.9472222222222223 | 0 |
| 0.9479166666666666 | 0 |
| 0.9486111111111111 | 0 |
| 0.9493055555555556 | 0 |
| 0.9500000000000001 | 0 |
| 0.9506944444444444 | 0 |
| 0.9513888888888888 | 0 |
| 0.9520833333333334 | 0 |
| 0.9527777777777778 | 0 |
| 0.9534722222222222 | 0 |
| 0.9541666666666666 | 0 |
| 0.9548611111111112 | 0 |
| 0.9555555555555556 | 0 |
| 0.9562499999999999 | 0 |
| 0.9569444444444444 | 0 |
| 0.9576388888888889 | 0 |
| 0.9583333333333334 | 0 |
| 0.9590277777777777 | 0 |
| 0.9597222222222223 | 0 |
| 0.9604166666666667 | 0 |
| 0.9611111111111111 | 0 |
| 0.9618055555555555 | 0 |
| 0.9625 | 0 |
| 0.9631944444444445 | 0 |
| 0.9638888888888889 | 0 |
| 0.9645833333333332 | 0 |
| 0.9652777777777778 | 0 |
| 0.9659722222222222 | 0 |
| 0.9666666666666667 | 0 |
| 0.967361111111111 | 0 |
| 0.9680555555555556 | 0 |
| 0.96875 | 0 |
| 0.9694444444444444 | 0 |
| 0.970138888888889 | 0 |
| 0.9708333333333333 | 0 |
| 0.9715277777777778 | 0 |
| 0.9722222222222222 | 0 |
| 0.9729166666666668 | 0 |
| 0.9736111111111111 | 0 |
| 0.9743055555555555 | 0 |
| 0.975 | 0 |
| 0.9756944444444445 | 0 |
| 0.9763888888888889 | 0 |
| 0.9770833333333333 | 0 |
| 0.9777777777777777 | 0 |
| 0.9784722222222223 | 0 |
| 0.9791666666666666 | 0 |
| 0.9798611111111111 | 0 |
| 0.9805555555555556 | 0 |
| 0.9812500000000001 | 0 |
| 0.9819444444444444 | 0 |
| 0.9826388888888888 | 0 |
| 0.9833333333333334 | 0 |
| 0.9840277777777778 | 0 |
| 0.9847222222222222 | 0 |
| 0.9854166666666666 | 0 |
| 0.9861111111111112 | 0 |
| 0.9868055555555556 | 0 |
| 0.9874999999999999 | 0 |
| 0.9881944444444444 | 0 |
| 0.9888888888888889 | 0 |
| 0.9895833333333334 | 0 |
| 0.9902777777777777 | 0 |
| 0.9909722222222223 | 0 |
| 0.9916666666666667 | 0 |
| 0.9923611111111111 | 0 |
| 0.9930555555555555 | 0 |
| 0.99375 | 0 |
| 0.9944444444444445 | 0 |
| 0.9951388888888889 | 0 |
| 0.9958333333333332 | 0 |
| 0.9965277777777778 | 0 |
| 0.9972222222222222 | 0 |
| 0.9979166666666667 | 0 |
| 0.998611111111111 | 0 |
| 0.9993055555555556 | 0 |